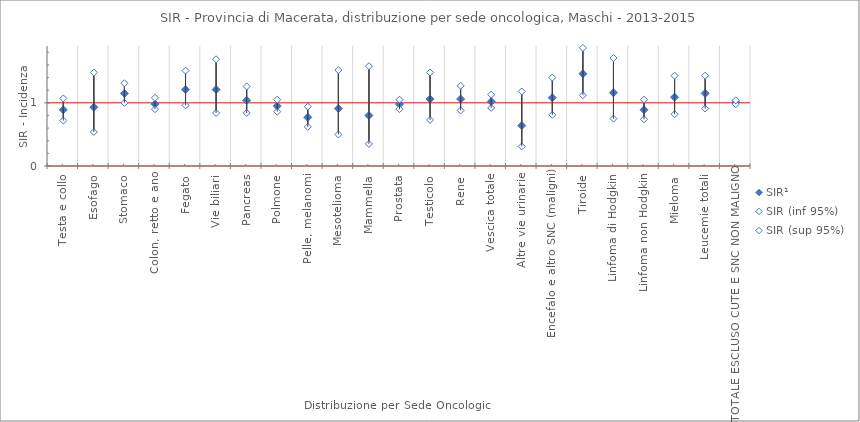
| Category | SIR¹ | SIR (inf 95%) | SIR (sup 95%) |
|---|---|---|---|
| Testa e collo | 0.89 | 0.72 | 1.07 |
| Esofago | 0.93 | 0.54 | 1.48 |
| Stomaco | 1.15 | 1 | 1.31 |
| Colon, retto e ano | 0.98 | 0.9 | 1.08 |
| Fegato | 1.21 | 0.96 | 1.51 |
| Vie biliari | 1.21 | 0.84 | 1.69 |
| Pancreas | 1.04 | 0.84 | 1.26 |
| Polmone | 0.95 | 0.86 | 1.05 |
| Pelle, melanomi | 0.77 | 0.62 | 0.94 |
| Mesotelioma | 0.91 | 0.5 | 1.52 |
| Mammella | 0.8 | 0.35 | 1.58 |
| Prostata | 0.98 | 0.9 | 1.05 |
| Testicolo | 1.06 | 0.73 | 1.48 |
| Rene | 1.06 | 0.88 | 1.27 |
| Vescica totale | 1.02 | 0.92 | 1.13 |
| Altre vie urinarie | 0.64 | 0.31 | 1.18 |
| Encefalo e altro SNC (maligni) | 1.08 | 0.81 | 1.4 |
| Tiroide | 1.46 | 1.12 | 1.87 |
| Linfoma di Hodgkin | 1.16 | 0.75 | 1.71 |
| Linfoma non Hodgkin | 0.89 | 0.74 | 1.05 |
| Mieloma | 1.09 | 0.82 | 1.43 |
| Leucemie totali | 1.15 | 0.91 | 1.43 |
| TOTALE ESCLUSO CUTE E SNC NON MALIGNO | 1.01 | 0.98 | 1.04 |